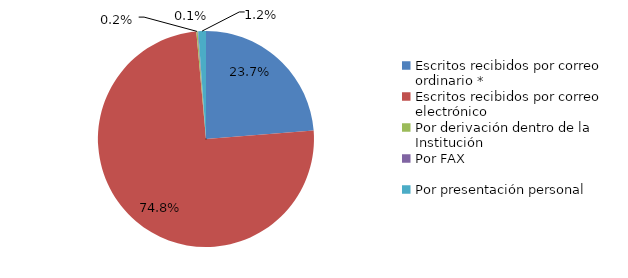
| Category | Series 0 |
|---|---|
| Escritos recibidos por correo ordinario * | 249 |
| Escritos recibidos por correo electrónico | 785 |
| Por derivación dentro de la Institución | 2 |
| Por FAX | 1 |
| Por presentación personal | 12 |